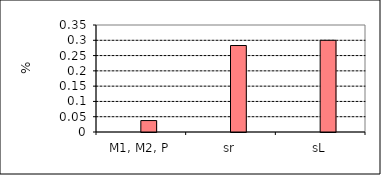
| Category | Series 1 | Series 0 | Series 5 | Series 6 |
|---|---|---|---|---|
| M1, M2, P |  |  | 0.037 |  |
| sr |  |  | 0.283 |  |
| sL |  |  | 0.3 |  |